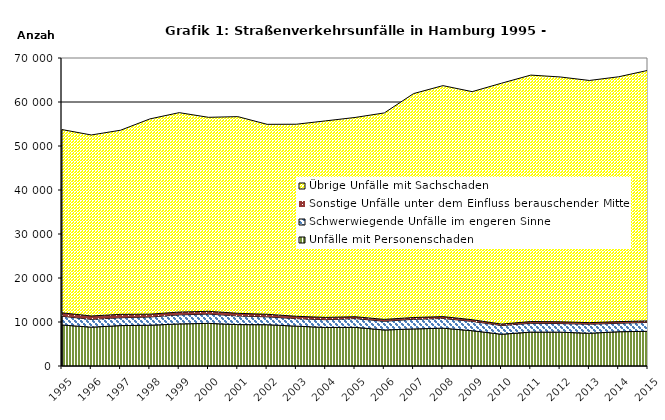
| Category | Unfälle mit Personenschaden | Schwerwiegende Unfälle im engeren Sinne | Sonstige Unfälle unter dem Einfluss berauschender Mittel 1) | Übrige Unfälle mit Sachschaden |
|---|---|---|---|---|
| 1995.0 | 9323 | 1981 | 775 | 41654 |
| 1996.0 | 8827 | 1775 | 772 | 41133 |
| 1997.0 | 9186 | 1789 | 763 | 41852 |
| 1998.0 | 9264 | 1869 | 648 | 44374 |
| 1999.0 | 9566 | 2055 | 634 | 45326 |
| 2000.0 | 9684 | 2114 | 632 | 44087 |
| 2001.0 | 9410 | 1972 | 596 | 44696 |
| 2002.0 | 9383 | 1782 | 592 | 43169 |
| 2003.0 | 9058 | 1702 | 542 | 43646 |
| 2004.0 | 8755 | 1770 | 513 | 44673 |
| 2005.0 | 8788 | 1991 | 422 | 45281 |
| 2006.0 | 8190 | 1977 | 424 | 46926 |
| 2007.0 | 8426 | 2186 | 404 | 50897 |
| 2008.0 | 8594 | 2206 | 432 | 52488 |
| 2009.0 | 8022 | 2115 | 380 | 51835 |
| 2010.0 | 7217 | 1987 | 324 | 54741 |
| 2011.0 | 7704 | 2003 | 394 | 56014 |
| 2012.0 | 7691 | 1958 | 401 | 55640 |
| 2013.0 | 7443 | 2059 | 355 | 55040 |
| 2014.0 | 7787 | 1921 | 380 | 55646 |
| 2015.0 | 7881 | 2030 | 341 | 56944 |